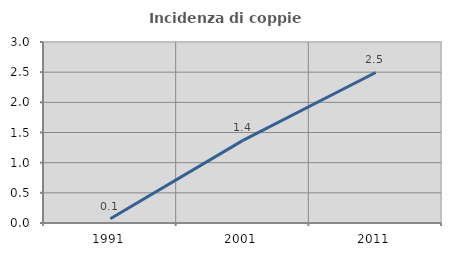
| Category | Incidenza di coppie miste |
|---|---|
| 1991.0 | 0.07 |
| 2001.0 | 1.369 |
| 2011.0 | 2.495 |